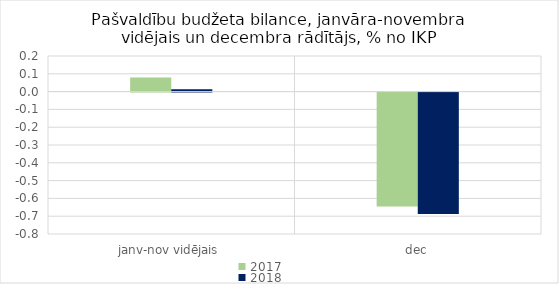
| Category | 2017 | 2018 |
|---|---|---|
| janv-nov vidējais | 0.079 | 0.013 |
| dec | -0.64 | -0.682 |